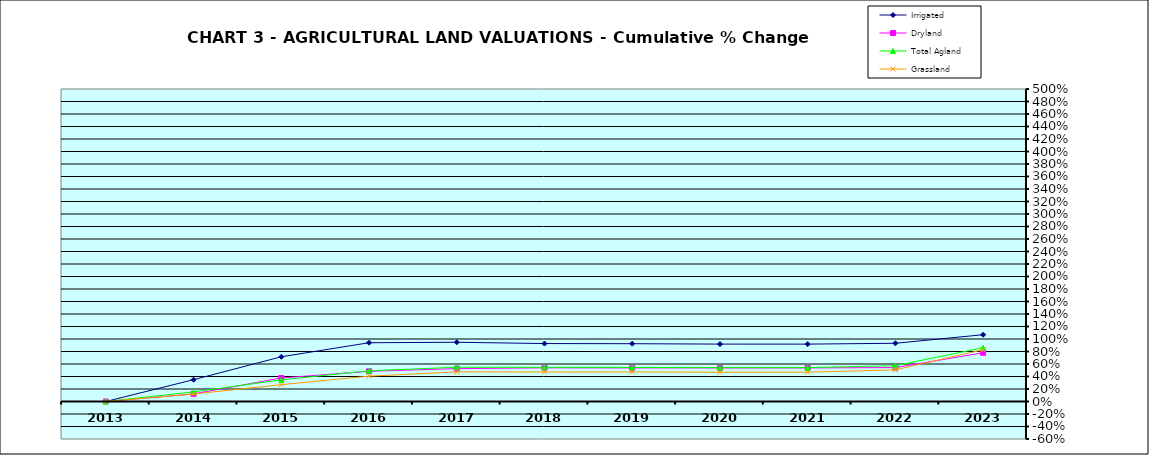
| Category | Irrigated | Dryland | Total Agland | Grassland |
|---|---|---|---|---|
| 2013.0 | 0 | 0 | 0 | 0 |
| 2014.0 | 0.349 | 0.122 | 0.154 | 0.119 |
| 2015.0 | 0.715 | 0.376 | 0.346 | 0.269 |
| 2016.0 | 0.94 | 0.483 | 0.492 | 0.405 |
| 2017.0 | 0.948 | 0.526 | 0.548 | 0.473 |
| 2018.0 | 0.927 | 0.538 | 0.547 | 0.472 |
| 2019.0 | 0.925 | 0.537 | 0.545 | 0.472 |
| 2020.0 | 0.918 | 0.537 | 0.542 | 0.469 |
| 2021.0 | 0.918 | 0.537 | 0.542 | 0.469 |
| 2022.0 | 0.932 | 0.543 | 0.573 | 0.506 |
| 2023.0 | 1.068 | 0.78 | 0.86 | 0.829 |